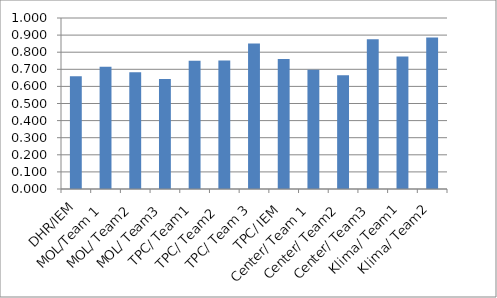
| Category | Series 0 |
|---|---|
| DHR/IEM | 0.659 |
| MOL/Team 1 | 0.714 |
| MOL/ Team2 | 0.683 |
| MOL/ Team3 | 0.644 |
| TPC/ Team1 | 0.749 |
| TPC/ Team2  | 0.751 |
| TPC/ Team 3 | 0.851 |
| TPC/ IEM | 0.761 |
| Center/ Team 1 | 0.698 |
| Center/ Team2 | 0.665 |
| Center/ Team3 | 0.876 |
| Klima/ Team1 | 0.774 |
| Klima/ Team2 | 0.886 |